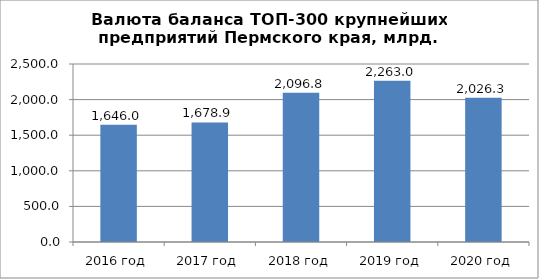
| Category | Валюта баланса |
|---|---|
| 2016 год | 1646 |
| 2017 год | 1678.9 |
| 2018 год | 2096.8 |
| 2019 год | 2263 |
| 2020 год | 2026.3 |